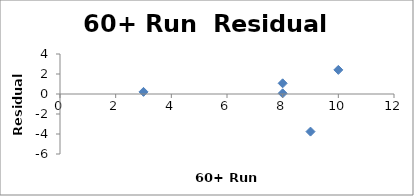
| Category | Series 0 |
|---|---|
| 10.0 | 2.411 |
| 9.0 | -3.76 |
| 8.0 | 1.068 |
| 8.0 | 0.068 |
| 3.0 | 0.212 |